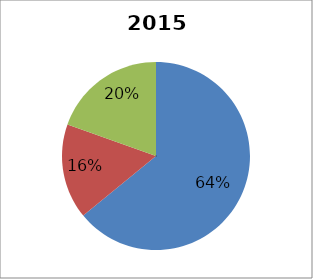
| Category | 2012 Breakdown |
|---|---|
| 0 | 0.641 |
| 1 | 0.164 |
| 2 | 0.195 |